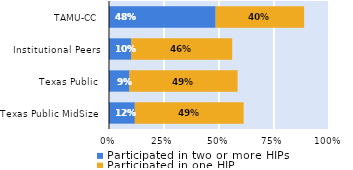
| Category | Participated in two or more HIPs | Participated in one HIP |
|---|---|---|
| Texas Public MidSize | 0.117 | 0.495 |
| Texas Public | 0.093 | 0.491 |
| Institutional Peers | 0.102 | 0.458 |
| TAMU-CC | 0.485 | 0.402 |